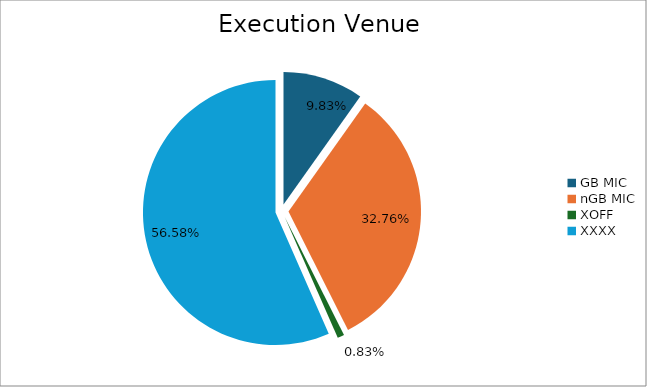
| Category | Series 0 |
|---|---|
| GB MIC | 1154821.961 |
| nGB MIC | 3849356.987 |
| XOFF | 97369.082 |
| XXXX | 6648574.381 |